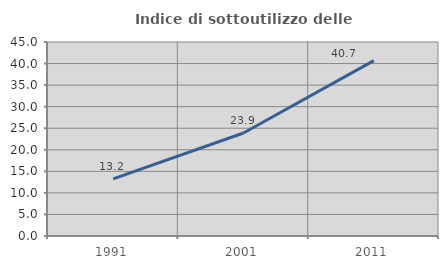
| Category | Indice di sottoutilizzo delle abitazioni  |
|---|---|
| 1991.0 | 13.239 |
| 2001.0 | 23.893 |
| 2011.0 | 40.666 |